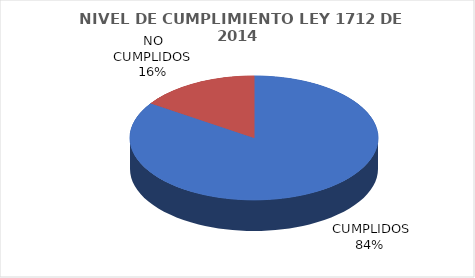
| Category | Series 0 |
|---|---|
|  CUMPLIDOS | 97 |
| NO CUMPLIDOS | 18 |